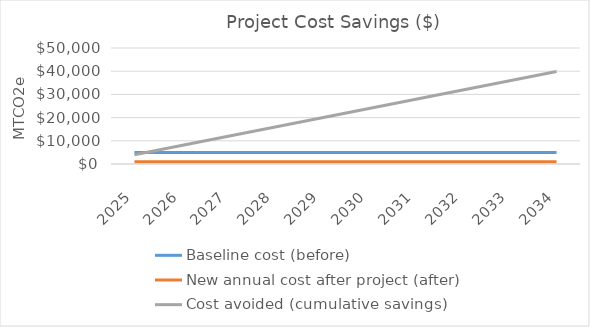
| Category | Baseline cost (before) | New annual cost after project (after) | Cost avoided (cumulative savings) |
|---|---|---|---|
| 2025.0 | 4983 | 996.6 | 3986.4 |
| 2026.0 | 4983 | 996.6 | 7972.8 |
| 2027.0 | 4983 | 996.6 | 11959.2 |
| 2028.0 | 4983 | 996.6 | 15945.6 |
| 2029.0 | 4983 | 996.6 | 19932 |
| 2030.0 | 4983 | 996.6 | 23918.4 |
| 2031.0 | 4983 | 996.6 | 27904.8 |
| 2032.0 | 4983 | 996.6 | 31891.2 |
| 2033.0 | 4983 | 996.6 | 35877.6 |
| 2034.0 | 4983 | 996.6 | 39864 |